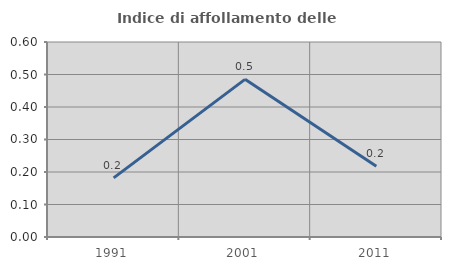
| Category | Indice di affollamento delle abitazioni  |
|---|---|
| 1991.0 | 0.182 |
| 2001.0 | 0.485 |
| 2011.0 | 0.218 |